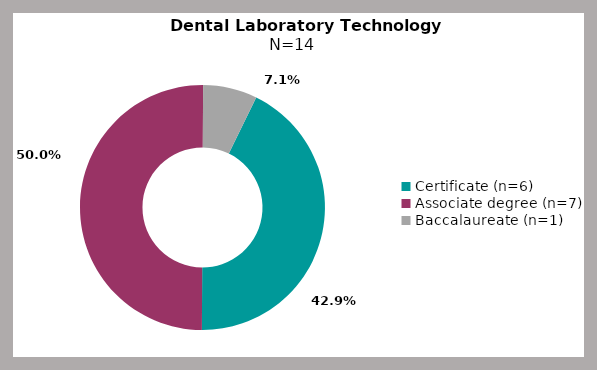
| Category | Series 0 |
|---|---|
| Certificate (n=6) | 0.429 |
| Associate degree (n=7) | 0.5 |
| Baccalaureate (n=1) | 0.071 |